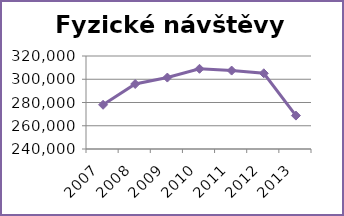
| Category | Fyzické návštěvy celkem |
|---|---|
| 2007.0 | 278040 |
| 2008.0 | 295912 |
| 2009.0 | 301444 |
| 2010.0 | 308993 |
| 2011.0 | 307463 |
| 2012.0 | 305134 |
| 2013.0 | 268727 |